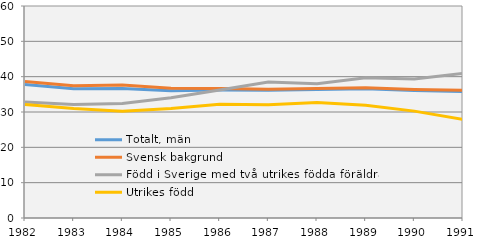
| Category | Totalt, män | Svensk bakgrund | Född i Sverige med två utrikes födda föräldrar | Utrikes född |
|---|---|---|---|---|
| 1982.0 | 37.761 | 38.623 | 32.858 | 32.125 |
| 1983.0 | 36.584 | 37.433 | 32.093 | 31.014 |
| 1984.0 | 36.657 | 37.639 | 32.388 | 30.236 |
| 1985.0 | 36.034 | 36.712 | 34.02 | 31.008 |
| 1986.0 | 36.237 | 36.683 | 36.2 | 32.191 |
| 1987.0 | 36.182 | 36.445 | 38.469 | 32.075 |
| 1988.0 | 36.377 | 36.637 | 38.01 | 32.692 |
| 1989.0 | 36.582 | 36.842 | 39.672 | 31.889 |
| 1990.0 | 36.049 | 36.392 | 39.362 | 30.246 |
| 1991.0 | 35.775 | 36.171 | 40.961 | 27.921 |